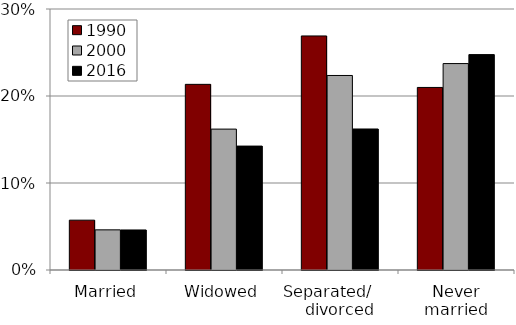
| Category | 1990 | 2000 | 2016 |
|---|---|---|---|
| Married | 0.057 | 0.046 | 0.046 |
| Widowed | 0.213 | 0.162 | 0.142 |
| Separated/      divorced | 0.269 | 0.224 | 0.162 |
| Never married | 0.21 | 0.237 | 0.248 |